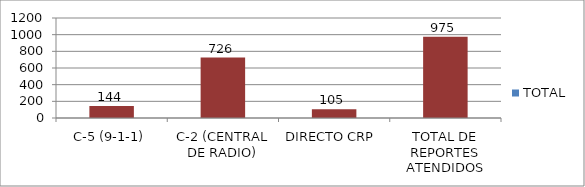
| Category | TOTAL |
|---|---|
| C-5 (9-1-1) | 144 |
| C-2 (CENTRAL DE RADIO) | 726 |
| DIRECTO CRP  | 105 |
| TOTAL DE REPORTES ATENDIDOS | 975 |